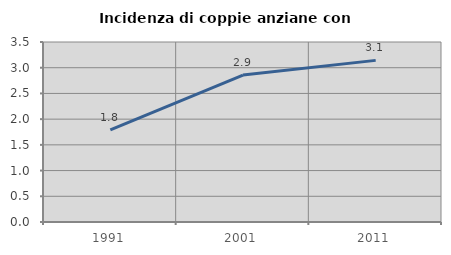
| Category | Incidenza di coppie anziane con figli |
|---|---|
| 1991.0 | 1.791 |
| 2001.0 | 2.857 |
| 2011.0 | 3.143 |